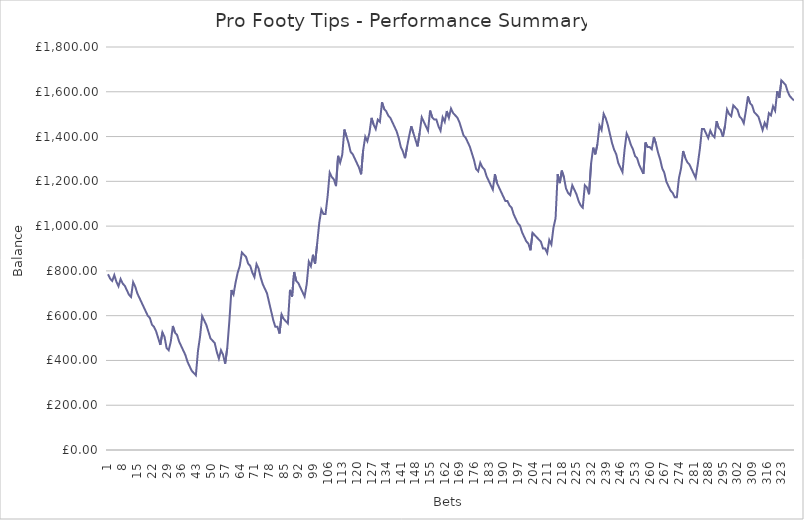
| Category | Balance |
|---|---|
| 0 | 785.2 |
| 1 | 765.2 |
| 2 | 755.2 |
| 3 | 781.2 |
| 4 | 751.2 |
| 5 | 731.2 |
| 6 | 763.6 |
| 7 | 743.6 |
| 8 | 733.6 |
| 9 | 713.6 |
| 10 | 693.6 |
| 11 | 683.6 |
| 12 | 749.6 |
| 13 | 729.6 |
| 14 | 699.6 |
| 15 | 679.6 |
| 16 | 659.6 |
| 17 | 639.6 |
| 18 | 619.6 |
| 19 | 599.6 |
| 20 | 589.6 |
| 21 | 559.6 |
| 22 | 549.6 |
| 23 | 529.6 |
| 24 | 499.6 |
| 25 | 469.6 |
| 26 | 525.6 |
| 27 | 505.6 |
| 28 | 455.6 |
| 29 | 445.6 |
| 30 | 484 |
| 31 | 554 |
| 32 | 524 |
| 33 | 514 |
| 34 | 484 |
| 35 | 464 |
| 36 | 444 |
| 37 | 424 |
| 38 | 394 |
| 39 | 374 |
| 40 | 354 |
| 41 | 344 |
| 42 | 334 |
| 43 | 442 |
| 44 | 507 |
| 45 | 598.2 |
| 46 | 578.2 |
| 47 | 558.2 |
| 48 | 528.2 |
| 49 | 498.2 |
| 50 | 488.2 |
| 51 | 478.2 |
| 52 | 438.2 |
| 53 | 408.2 |
| 54 | 445.7 |
| 55 | 425.7 |
| 56 | 385.7 |
| 57 | 454.7 |
| 58 | 574.7 |
| 59 | 714.7 |
| 60 | 694.7 |
| 61 | 748.7 |
| 62 | 792.2 |
| 63 | 822.2 |
| 64 | 882.2 |
| 65 | 872.2 |
| 66 | 862.2 |
| 67 | 832.2 |
| 68 | 822.2 |
| 69 | 792.2 |
| 70 | 772.2 |
| 71 | 830.2 |
| 72 | 810.2 |
| 73 | 770.2 |
| 74 | 740.2 |
| 75 | 720.2 |
| 76 | 700.2 |
| 77 | 660.2 |
| 78 | 620.2 |
| 79 | 580.2 |
| 80 | 550.2 |
| 81 | 550.2 |
| 82 | 520.2 |
| 83 | 605.2 |
| 84 | 585.2 |
| 85 | 575.2 |
| 86 | 565.2 |
| 87 | 715.2 |
| 88 | 685.2 |
| 89 | 795.2 |
| 90 | 755.2 |
| 91 | 745.2 |
| 92 | 725.2 |
| 93 | 705.2 |
| 94 | 685.2 |
| 95 | 741.2 |
| 96 | 841.1 |
| 97 | 821.1 |
| 98 | 872.1 |
| 99 | 832.1 |
| 100 | 922.1 |
| 101 | 1014.1 |
| 102 | 1074.1 |
| 103 | 1054.1 |
| 104 | 1054.1 |
| 105 | 1133.9 |
| 106 | 1238.9 |
| 107 | 1218.9 |
| 108 | 1208.9 |
| 109 | 1178.9 |
| 110 | 1313.9 |
| 111 | 1283.9 |
| 112 | 1319.3 |
| 113 | 1431.3 |
| 114 | 1401.3 |
| 115 | 1371.3 |
| 116 | 1331.3 |
| 117 | 1321.3 |
| 118 | 1301.3 |
| 119 | 1281.3 |
| 120 | 1261.3 |
| 121 | 1231.3 |
| 122 | 1339.3 |
| 123 | 1399.3 |
| 124 | 1379.3 |
| 125 | 1416.8 |
| 126 | 1483.4 |
| 127 | 1453.4 |
| 128 | 1433.4 |
| 129 | 1475.4 |
| 130 | 1465.4 |
| 131 | 1553.4 |
| 132 | 1523.4 |
| 133 | 1513.4 |
| 134 | 1493.4 |
| 135 | 1483.4 |
| 136 | 1463.4 |
| 137 | 1443.4 |
| 138 | 1423.4 |
| 139 | 1393.4 |
| 140 | 1353.4 |
| 141 | 1333.4 |
| 142 | 1303.4 |
| 143 | 1355.4 |
| 144 | 1403.4 |
| 145 | 1446 |
| 146 | 1416 |
| 147 | 1386 |
| 148 | 1356 |
| 149 | 1416 |
| 150 | 1486 |
| 151 | 1466 |
| 152 | 1446 |
| 153 | 1426 |
| 154 | 1516 |
| 155 | 1486 |
| 156 | 1476 |
| 157 | 1476 |
| 158 | 1446 |
| 159 | 1426 |
| 160 | 1486 |
| 161 | 1466 |
| 162 | 1514 |
| 163 | 1484 |
| 164 | 1525 |
| 165 | 1505 |
| 166 | 1495 |
| 167 | 1485 |
| 168 | 1465 |
| 169 | 1435 |
| 170 | 1405 |
| 171 | 1395 |
| 172 | 1375 |
| 173 | 1355 |
| 174 | 1325 |
| 175 | 1295 |
| 176 | 1255 |
| 177 | 1245 |
| 178 | 1283 |
| 179 | 1263 |
| 180 | 1253 |
| 181 | 1223 |
| 182 | 1203 |
| 183 | 1183 |
| 184 | 1163 |
| 185 | 1232 |
| 186 | 1192 |
| 187 | 1172 |
| 188 | 1152 |
| 189 | 1132 |
| 190 | 1112 |
| 191 | 1112 |
| 192 | 1092 |
| 193 | 1082 |
| 194 | 1052 |
| 195 | 1032 |
| 196 | 1012 |
| 197 | 1002 |
| 198 | 972 |
| 199 | 952 |
| 200 | 932 |
| 201 | 922 |
| 202 | 892 |
| 203 | 970 |
| 204 | 960 |
| 205 | 950 |
| 206 | 940 |
| 207 | 930 |
| 208 | 900 |
| 209 | 900 |
| 210 | 880 |
| 211 | 938 |
| 212 | 918 |
| 213 | 993 |
| 214 | 1035 |
| 215 | 1232 |
| 216 | 1192 |
| 217 | 1248 |
| 218 | 1218 |
| 219 | 1168 |
| 220 | 1148 |
| 221 | 1138 |
| 222 | 1182.4 |
| 223 | 1162.4 |
| 224 | 1142.4 |
| 225 | 1112.4 |
| 226 | 1092.4 |
| 227 | 1082.4 |
| 228 | 1182.4 |
| 229 | 1172.4 |
| 230 | 1142.4 |
| 231 | 1280.4 |
| 232 | 1350.4 |
| 233 | 1320.4 |
| 234 | 1365.4 |
| 235 | 1449.4 |
| 236 | 1429.4 |
| 237 | 1501.4 |
| 238 | 1481.4 |
| 239 | 1451.4 |
| 240 | 1411.4 |
| 241 | 1371.4 |
| 242 | 1341.4 |
| 243 | 1321.4 |
| 244 | 1281.4 |
| 245 | 1261.4 |
| 246 | 1241.4 |
| 247 | 1341.4 |
| 248 | 1413.4 |
| 249 | 1393.4 |
| 250 | 1363.4 |
| 251 | 1343.4 |
| 252 | 1313.4 |
| 253 | 1303.4 |
| 254 | 1273.4 |
| 255 | 1253.4 |
| 256 | 1233.4 |
| 257 | 1373.4 |
| 258 | 1353.4 |
| 259 | 1353.4 |
| 260 | 1343.4 |
| 261 | 1398.4 |
| 262 | 1368.4 |
| 263 | 1328.4 |
| 264 | 1298.4 |
| 265 | 1258.4 |
| 266 | 1238.4 |
| 267 | 1198.4 |
| 268 | 1178.4 |
| 269 | 1158.4 |
| 270 | 1148.4 |
| 271 | 1128.4 |
| 272 | 1128.4 |
| 273 | 1214.4 |
| 274 | 1257.4 |
| 275 | 1335.4 |
| 276 | 1305.4 |
| 277 | 1285.4 |
| 278 | 1275.4 |
| 279 | 1255.4 |
| 280 | 1235.4 |
| 281 | 1215.4 |
| 282 | 1275.4 |
| 283 | 1344.4 |
| 284 | 1433.4 |
| 285 | 1433.4 |
| 286 | 1413.4 |
| 287 | 1393.4 |
| 288 | 1426.7 |
| 289 | 1406.7 |
| 290 | 1396.7 |
| 291 | 1468.7 |
| 292 | 1438.7 |
| 293 | 1428.7 |
| 294 | 1398.7 |
| 295 | 1446.2 |
| 296 | 1520.9 |
| 297 | 1500.9 |
| 298 | 1490.9 |
| 299 | 1539.5 |
| 300 | 1529.5 |
| 301 | 1519.5 |
| 302 | 1489.5 |
| 303 | 1479.5 |
| 304 | 1459.5 |
| 305 | 1514.5 |
| 306 | 1579 |
| 307 | 1549 |
| 308 | 1539 |
| 309 | 1509 |
| 310 | 1499 |
| 311 | 1489 |
| 312 | 1459 |
| 313 | 1429 |
| 314 | 1461.4 |
| 315 | 1441.4 |
| 316 | 1504.4 |
| 317 | 1494.4 |
| 318 | 1535.4 |
| 319 | 1515.4 |
| 320 | 1602.8 |
| 321 | 1572.8 |
| 322 | 1650.8 |
| 323 | 1640.8 |
| 324 | 1630.8 |
| 325 | 1600.8 |
| 326 | 1580.8 |
| 327 | 1570.8 |
| 328 | 1560.8 |